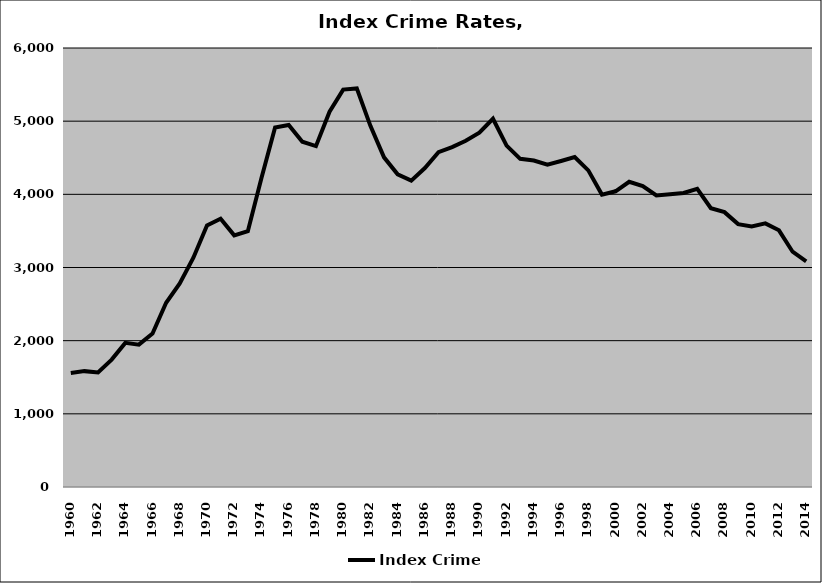
| Category | Index Crime |
|---|---|
| 1960.0 | 1558.838 |
| 1961.0 | 1583.556 |
| 1962.0 | 1565.802 |
| 1963.0 | 1741.119 |
| 1964.0 | 1969.663 |
| 1965.0 | 1946.071 |
| 1966.0 | 2098.748 |
| 1967.0 | 2518.378 |
| 1968.0 | 2780.937 |
| 1969.0 | 3134.209 |
| 1970.0 | 3574.384 |
| 1971.0 | 3666.19 |
| 1972.0 | 3439.395 |
| 1973.0 | 3495.853 |
| 1974.0 | 4223.442 |
| 1975.0 | 4914.444 |
| 1976.0 | 4948.195 |
| 1977.0 | 4719.877 |
| 1978.0 | 4658.815 |
| 1979.0 | 5129.82 |
| 1980.0 | 5431.387 |
| 1981.0 | 5447.355 |
| 1982.0 | 4935.539 |
| 1983.0 | 4505.127 |
| 1984.0 | 4273.075 |
| 1985.0 | 4187.286 |
| 1986.0 | 4358.696 |
| 1987.0 | 4575.297 |
| 1988.0 | 4645.272 |
| 1989.0 | 4733.217 |
| 1990.0 | 4843.435 |
| 1991.0 | 5033.001 |
| 1992.0 | 4665.505 |
| 1993.0 | 4485.303 |
| 1994.0 | 4461.448 |
| 1995.0 | 4405.192 |
| 1996.0 | 4455.661 |
| 1997.0 | 4510.147 |
| 1998.0 | 4327.469 |
| 1999.0 | 3996.569 |
| 2000.0 | 4041.825 |
| 2001.0 | 4171.615 |
| 2002.0 | 4111.81 |
| 2003.0 | 3983.92 |
| 2004.0 | 4001.033 |
| 2005.0 | 4017.781 |
| 2006.0 | 4075.734 |
| 2007.0 | 3809.943 |
| 2008.0 | 3756.665 |
| 2009.0 | 3593.206 |
| 2010.0 | 3560.411 |
| 2011.0 | 3602.719 |
| 2012.0 | 3507.841 |
| 2013.0 | 3215.83 |
| 2014.0 | 3083.948 |